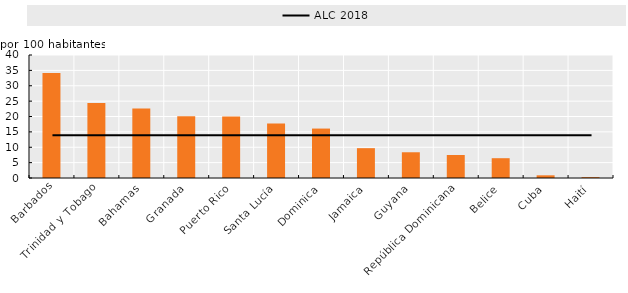
| Category | Barbados |
|---|---|
| Barbados | 34.117 |
| Trinidad y Tobago | 24.401 |
| Bahamas | 22.577 |
| Granada | 20.054 |
| Puerto Rico | 20.036 |
| Santa Lucía | 17.739 |
| Dominica | 16.075 |
| Jamaica | 9.703 |
| Guyana | 8.37 |
| República Dominicana | 7.479 |
| Belice | 6.437 |
| Cuba | 0.872 |
| Haití | 0.28 |